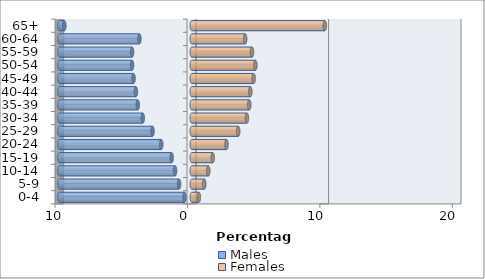
| Category | Males | Females |
|---|---|---|
| 0-4 | -0.546 | 0.532 |
| 5-9 | -0.96 | 0.943 |
| 10-14 | -1.262 | 1.249 |
| 15-19 | -1.517 | 1.581 |
| 20-24 | -2.306 | 2.622 |
| 25-29 | -2.966 | 3.504 |
| 30-34 | -3.7 | 4.163 |
| 35-39 | -4.078 | 4.34 |
| 40-44 | -4.219 | 4.422 |
| 45-49 | -4.399 | 4.67 |
| 50-54 | -4.51 | 4.802 |
| 55-59 | -4.509 | 4.546 |
| 60-64 | -3.954 | 4.031 |
| 65+ | -9.622 | 10.045 |